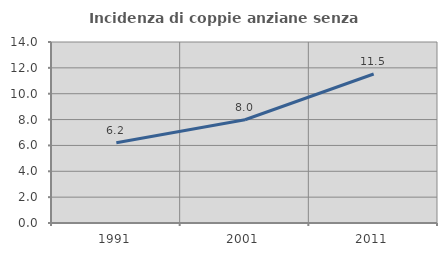
| Category | Incidenza di coppie anziane senza figli  |
|---|---|
| 1991.0 | 6.21 |
| 2001.0 | 7.984 |
| 2011.0 | 11.524 |